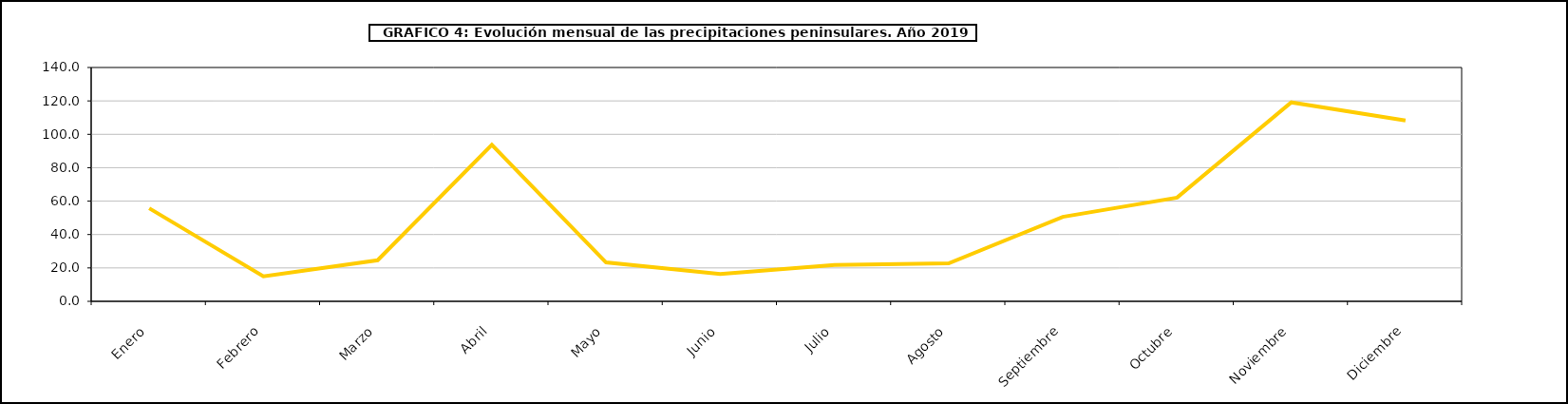
| Category | peninsula |
|---|---|
| 0 | 55.7 |
| 1 | 15 |
| 2 | 24.6 |
| 3 | 93.7 |
| 4 | 23.3 |
| 5 | 16.4 |
| 6 | 21.8 |
| 7 | 22.7 |
| 8 | 50.6 |
| 9 | 62.1 |
| 10 | 119.1 |
| 11 | 108.3 |